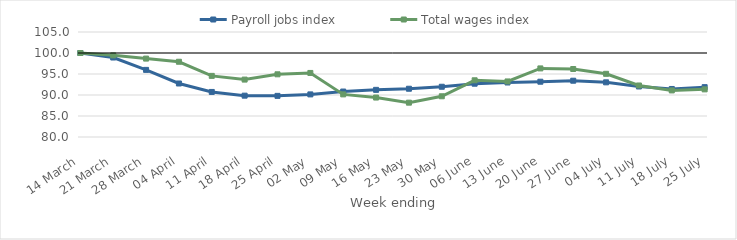
| Category | Payroll jobs index | Total wages index |
|---|---|---|
| 2020-03-14 | 100 | 100 |
| 2020-03-21 | 98.921 | 99.436 |
| 2020-03-28 | 95.981 | 98.668 |
| 2020-04-04 | 92.741 | 97.916 |
| 2020-04-11 | 90.729 | 94.554 |
| 2020-04-18 | 89.842 | 93.669 |
| 2020-04-25 | 89.792 | 94.927 |
| 2020-05-02 | 90.143 | 95.252 |
| 2020-05-09 | 90.826 | 90.146 |
| 2020-05-16 | 91.224 | 89.392 |
| 2020-05-23 | 91.488 | 88.174 |
| 2020-05-30 | 91.964 | 89.696 |
| 2020-06-06 | 92.689 | 93.502 |
| 2020-06-13 | 92.979 | 93.227 |
| 2020-06-20 | 93.164 | 96.331 |
| 2020-06-27 | 93.402 | 96.19 |
| 2020-07-04 | 93.016 | 95.044 |
| 2020-07-11 | 92.028 | 92.267 |
| 2020-07-18 | 91.435 | 91.087 |
| 2020-07-25 | 91.868 | 91.342 |